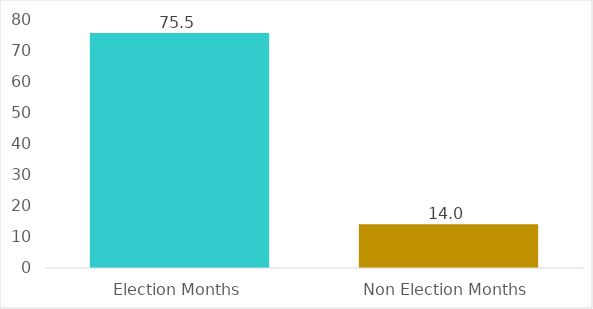
| Category | Average Monthly Payments |
|---|---|
| Election Months | 75.522 |
| Non Election Months | 14.036 |